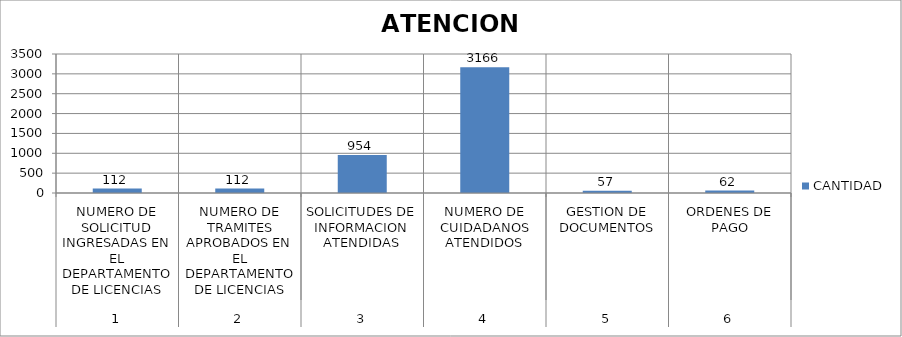
| Category | CANTIDAD |
|---|---|
| 0 | 112 |
| 1 | 112 |
| 2 | 954 |
| 3 | 3166 |
| 4 | 57 |
| 5 | 62 |